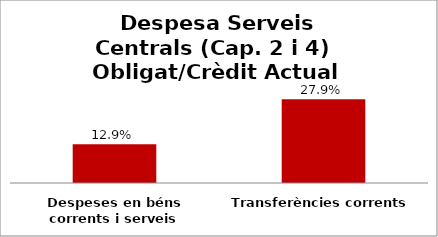
| Category | Series 0 |
|---|---|
| Despeses en béns corrents i serveis | 0.129 |
| Transferències corrents | 0.279 |